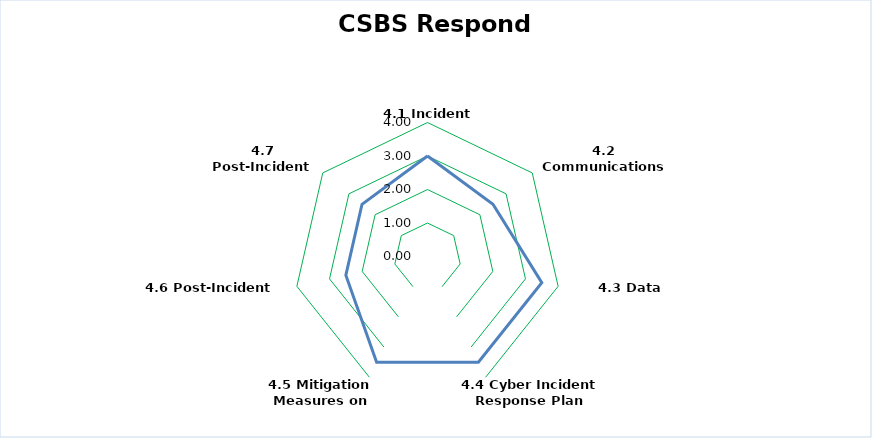
| Category | Respond |
|---|---|
| 4.1 Incident Recording | 3 |
| 4.2 Communications Plans | 2.5 |
| 4.3 Data Obligations | 3.5 |
| 4.4 Cyber Incident Response Plan Review | 3.5 |
| 4.5 Mitigation Measures on Detections | 3.5 |
| 4.6 Post-Incident Sharing | 2.5 |
| 4.7 Post-Incident Lessons Learned | 2.5 |